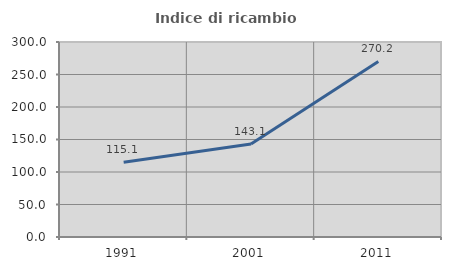
| Category | Indice di ricambio occupazionale  |
|---|---|
| 1991.0 | 115.064 |
| 2001.0 | 143.137 |
| 2011.0 | 270.157 |